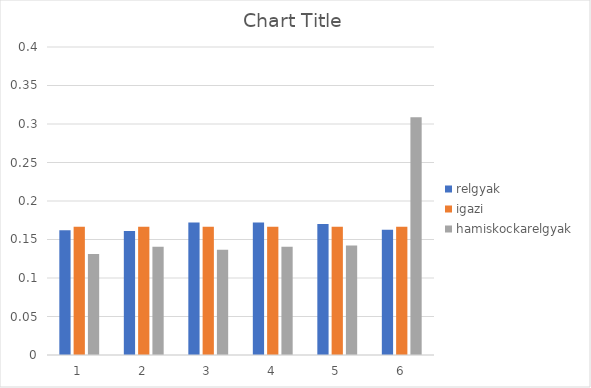
| Category | relgyak | igazi | hamiskockarelgyak |
|---|---|---|---|
| 0 | 0.162 | 0.167 | 0.131 |
| 1 | 0.161 | 0.167 | 0.14 |
| 2 | 0.172 | 0.167 | 0.137 |
| 3 | 0.172 | 0.167 | 0.14 |
| 4 | 0.17 | 0.167 | 0.142 |
| 5 | 0.163 | 0.167 | 0.309 |